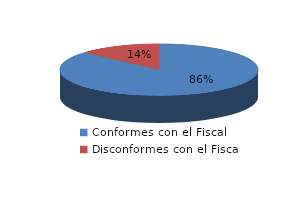
| Category | Series 0 |
|---|---|
| 0 | 638 |
| 1 | 100 |